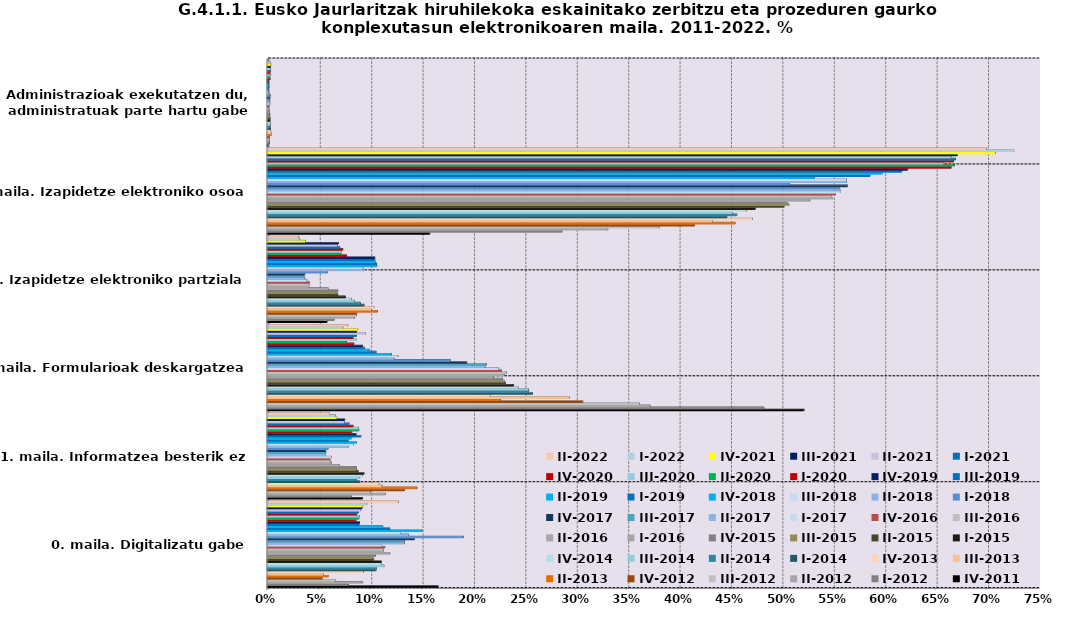
| Category | IV-2011 | I-2012 | II-2012 | III-2012 | IV-2012 | II-2013 | III-2013 | IV-2013 | I-2014 | II-2014 | III-2014 | IV-2014 | I-2015 | II-2015 | III-2015 | IV-2015 | I-2016 | II-2016 | III-2016 | IV-2016 | I-2017 | II-2017 | III-2017 | IV-2017 | I-2018 | II-2018 | III-2018 | IV-2018 | I-2019 | II-2019 | III-2019 | IV-2019 | I-2020 | II-2020 | III-2020 | IV-2020 | I-2021 | II-2021 | III-2021 | IV-2021 | I-2022 | II-2022 |
|---|---|---|---|---|---|---|---|---|---|---|---|---|---|---|---|---|---|---|---|---|---|---|---|---|---|---|---|---|---|---|---|---|---|---|---|---|---|---|---|---|---|---|
|  0. maila. Digitalizatu gabe | 0.166 | 0.079 | 0.093 | 0.066 | 0.054 | 0.06 | 0.055 | 0.094 | 0.106 | 0.106 | 0.114 | 0.111 | 0.111 | 0.104 | 0.103 | 0.106 | 0.119 | 0.113 | 0.113 | 0.115 | 0.112 | 0.134 | 0.134 | 0.144 | 0.191 | 0.138 | 0.13 | 0.151 | 0.12 | 0.113 | 0.09 | 0.09 | 0.087 | 0.089 | 0.09 | 0.087 | 0.089 | 0.091 | 0.093 | 0.093 | 0.097 | 0.128 |
| 1. maila. Informatzea besterik ez | 0.093 | 0.082 | 0.115 | 0.101 | 0.134 | 0.146 | 0.112 | 0.109 | 0.09 | 0.087 | 0.09 | 0.093 | 0.095 | 0.089 | 0.087 | 0.087 | 0.071 | 0.063 | 0.062 | 0.061 | 0.063 | 0.057 | 0.057 | 0.057 | 0.06 | 0.079 | 0.084 | 0.087 | 0.079 | 0.082 | 0.091 | 0.087 | 0.083 | 0.089 | 0.089 | 0.084 | 0.08 | 0.075 | 0.076 | 0.068 | 0.066 | 0.061 |
| 2. maila. Formularioak deskargatzea | 0.522 | 0.483 | 0.373 | 0.362 | 0.307 | 0.227 | 0.294 | 0.217 | 0.258 | 0.255 | 0.254 | 0.244 | 0.24 | 0.232 | 0.231 | 0.229 | 0.22 | 0.231 | 0.233 | 0.228 | 0.226 | 0.212 | 0.213 | 0.194 | 0.179 | 0.124 | 0.128 | 0.121 | 0.106 | 0.1 | 0.095 | 0.093 | 0.085 | 0.077 | 0.087 | 0.084 | 0.087 | 0.096 | 0.087 | 0.088 | 0.074 | 0.079 |
| 3. maila. Izapidetze elektroniko partziala | 0.059 | 0.065 | 0.086 | 0.087 | 0.087 | 0.108 | 0.102 | 0.104 | 0.094 | 0.091 | 0.085 | 0.082 | 0.076 | 0.069 | 0.068 | 0.069 | 0.059 | 0.041 | 0.041 | 0.042 | 0.039 | 0.037 | 0.036 | 0.037 | 0.059 | 0.094 | 0.094 | 0.107 | 0.107 | 0.106 | 0.105 | 0.105 | 0.077 | 0.072 | 0.072 | 0.074 | 0.071 | 0.068 | 0.069 | 0.038 | 0.032 | 0.031 |
| 4. maila. Izapidetze elektroniko osoa | 0.158 | 0.287 | 0.332 | 0.382 | 0.416 | 0.455 | 0.433 | 0.472 | 0.447 | 0.457 | 0.453 | 0.466 | 0.475 | 0.503 | 0.508 | 0.506 | 0.528 | 0.55 | 0.549 | 0.553 | 0.558 | 0.557 | 0.557 | 0.565 | 0.509 | 0.564 | 0.564 | 0.532 | 0.587 | 0.598 | 0.617 | 0.623 | 0.666 | 0.669 | 0.658 | 0.668 | 0.67 | 0.665 | 0.672 | 0.709 | 0.727 | 0.7 |
| 5. maila. Administrazioak exekutatzen du, administratuak parte hartu gabe | 0.001 | 0.003 | 0.002 | 0.002 | 0.002 | 0.004 | 0.004 | 0.004 | 0.004 | 0.003 | 0.003 | 0.003 | 0.003 | 0.003 | 0.003 | 0.003 | 0.002 | 0.002 | 0.002 | 0.002 | 0.003 | 0.003 | 0.003 | 0.003 | 0.003 | 0.002 | 0.001 | 0.001 | 0.002 | 0.002 | 0.002 | 0.002 | 0.003 | 0.003 | 0.003 | 0.003 | 0.003 | 0.004 | 0.004 | 0.004 | 0.004 | 0.002 |